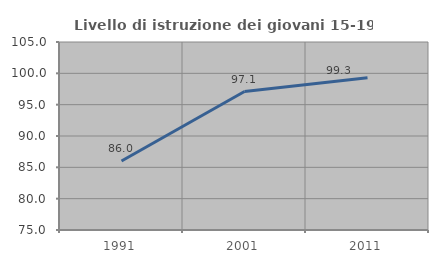
| Category | Livello di istruzione dei giovani 15-19 anni |
|---|---|
| 1991.0 | 86.018 |
| 2001.0 | 97.098 |
| 2011.0 | 99.299 |